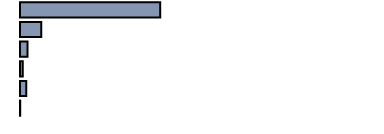
| Category | 50,1 |
|---|---|
| 0 | 39.271 |
| 1 | 5.979 |
| 2 | 2.081 |
| 3 | 0.767 |
| 4 | 1.761 |
| 5 | 0.059 |